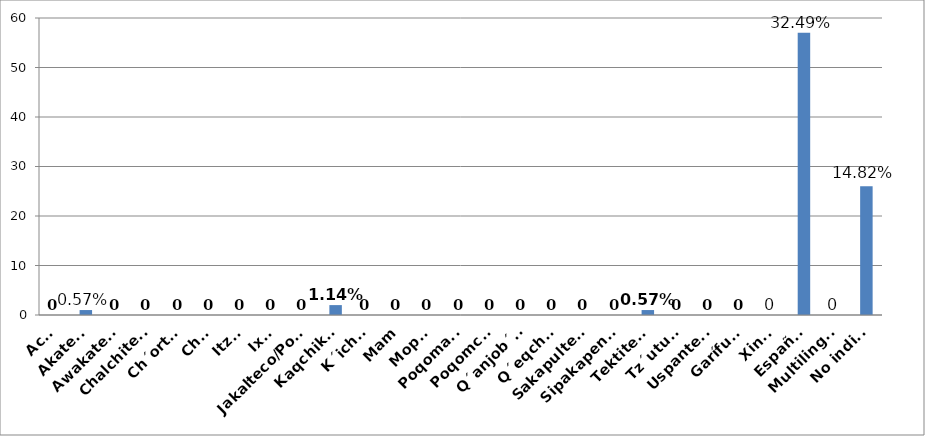
| Category | Series 0 |
|---|---|
| Achi | 0 |
| Akateko | 1 |
| Awakateco | 0 |
| Chalchiteco | 0 |
| Ch´orti´ | 0 |
| Chuj | 0 |
| Itza´ | 0 |
| Ixil | 0 |
| Jakalteco/Popti´ | 0 |
| Kaqchikel | 2 |
| K´iche´ | 0 |
| Mam | 0 |
| Mopan | 0 |
| Poqomam | 0 |
| Poqomchi´ | 0 |
| Q´anjob´al | 0 |
| Q´eqchi´ | 0 |
| Sakapulteco | 0 |
| Sipakapense | 0 |
| Tektiteco | 1 |
| Tz´utujil | 0 |
| Uspanteko | 0 |
| Garífuna | 0 |
| Xinka | 0 |
| Español | 57 |
| Multilingüe | 0 |
| No indica | 26 |